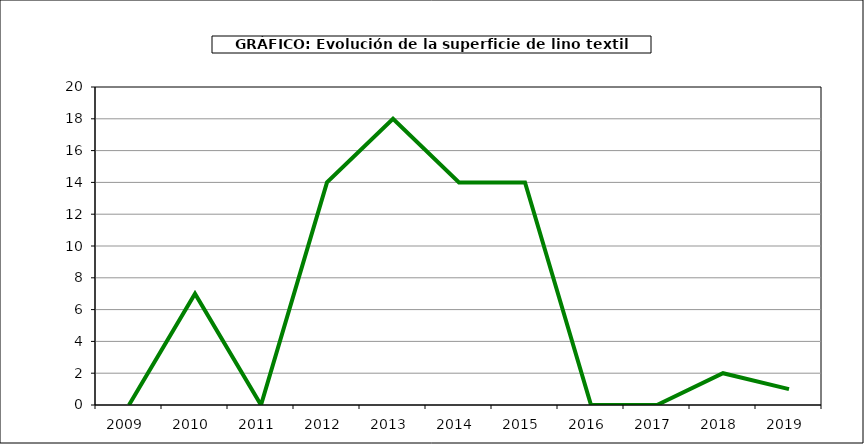
| Category | Superficie |
|---|---|
| 2009.0 | 0 |
| 2010.0 | 7 |
| 2011.0 | 0 |
| 2012.0 | 14 |
| 2013.0 | 18 |
| 2014.0 | 14 |
| 2015.0 | 14 |
| 2016.0 | 0 |
| 2017.0 | 0 |
| 2018.0 | 2 |
| 2019.0 | 1 |